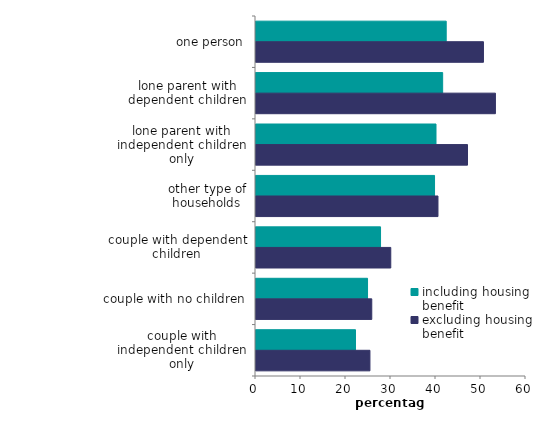
| Category | including housing benefit | excluding housing benefit |
|---|---|---|
| one person | 42.271 | 50.546 |
| lone parent with dependent children | 41.48 | 53.207 |
| lone parent with independent children only | 40 | 47 |
| other type of households | 39.674 | 40.438 |
| couple with dependent children | 27.675 | 29.948 |
| couple with no children | 24.785 | 25.726 |
| couple with independent children only | 22.108 | 25.321 |